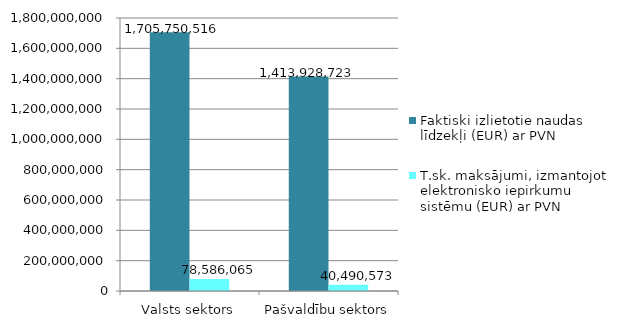
| Category | Faktiski izlietotie naudas līdzekļi (EUR) ar PVN | T.sk. maksājumi, izmantojot elektronisko iepirkumu sistēmu (EUR) ar PVN |
|---|---|---|
| Valsts sektors | 1705750516 | 78586065 |
| Pašvaldību sektors | 1413928723 | 40490573 |